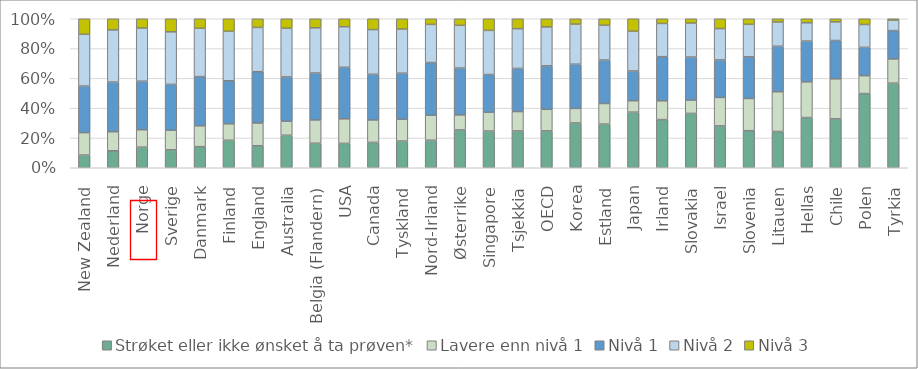
| Category | Strøket eller ikke ønsket å ta prøven* | Lavere enn nivå 1 | Nivå 1 | Nivå 2 | Nivå 3 |
|---|---|---|---|---|---|
| New Zealand | 8.332 | 14.732 | 30.605 | 34.015 | 10.173 |
| Nederland | 11.149 | 12.469 | 32.555 | 34.258 | 7.276 |
| Norge | 13.507 | 11.448 | 31.818 | 34.908 | 6.072 |
| Sverige | 12.013 | 13.135 | 30.774 | 35.208 | 8.772 |
| Danmark | 14.13 | 13.919 | 32.887 | 32.342 | 6.33 |
| Finland | 18.432 | 11.031 | 28.852 | 33.209 | 8.352 |
| England | 14.496 | 15.077 | 33.836 | 29.265 | 5.714 |
| Australia | 21.209 | 9.193 | 28.887 | 31.793 | 6.177 |
| Belgia (Flandern) | 15.589 | 14.849 | 29.841 | 28.745 | 5.765 |
| USA | 15.625 | 15.801 | 33.091 | 26.038 | 5.098 |
| Canada | 16.681 | 14.781 | 30.046 | 29.432 | 7.124 |
| Tyskland | 17.658 | 14.379 | 30.454 | 29.173 | 6.803 |
| Nord-Irland | 18.088 | 16.426 | 34.544 | 25.02 | 3.713 |
| Østerrike | 24.923 | 9.902 | 30.857 | 28.14 | 4.328 |
| Singapore | 24.387 | 12.477 | 25.055 | 29.314 | 7.715 |
| Tsjekkia | 24.548 | 12.914 | 28.759 | 26.532 | 6.612 |
| OECD | 24.313 | 14.216 | 28.659 | 25.671 | 5.382 |
| Korea | 29.971 | 9.754 | 29.598 | 26.814 | 3.596 |
| Estland | 29.132 | 13.772 | 29.034 | 23.237 | 4.319 |
| Japan | 36.844 | 7.575 | 19.74 | 26.333 | 8.252 |
| Irland | 32.146 | 12.552 | 29.459 | 22.149 | 3.143 |
| Slovakia | 36.378 | 8.926 | 28.786 | 22.761 | 2.868 |
| Israel | 27.052 | 18.405 | 24.255 | 20.255 | 6.37 |
| Slovenia | 24.716 | 21.441 | 27.732 | 21.646 | 3.71 |
| Litauen | 23.243 | 25.475 | 29.158 | 15.564 | 2.058 |
| Hellas | 31.439 | 22.39 | 25.498 | 11.502 | 2.501 |
| Chile | 32.682 | 26.759 | 25.606 | 12.45 | 2.101 |
| Polen | 49.757 | 12.047 | 18.971 | 15.36 | 3.845 |
| Tyrkia | 55.631 | 15.935 | 18.638 | 6.867 | 0.925 |